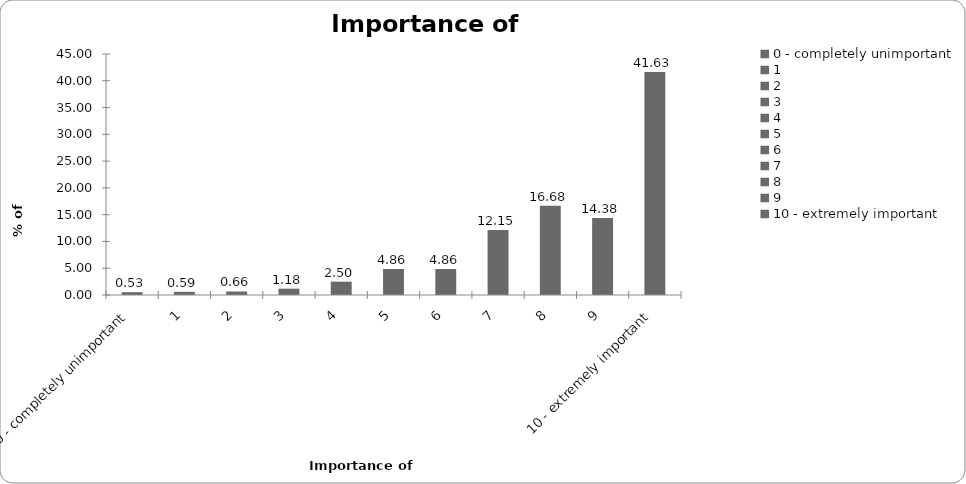
| Category | Importance of insurance |
|---|---|
| 0 - completely unimportant | 0.525 |
| 1 | 0.591 |
| 2 | 0.657 |
| 3 | 1.182 |
| 4 | 2.495 |
| 5 | 4.859 |
| 6 | 4.859 |
| 7 | 12.147 |
| 8 | 16.678 |
| 9 | 14.38 |
| 10 - extremely important | 41.628 |